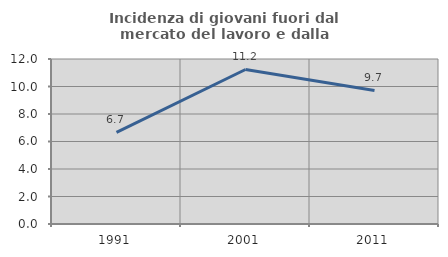
| Category | Incidenza di giovani fuori dal mercato del lavoro e dalla formazione  |
|---|---|
| 1991.0 | 6.66 |
| 2001.0 | 11.238 |
| 2011.0 | 9.709 |